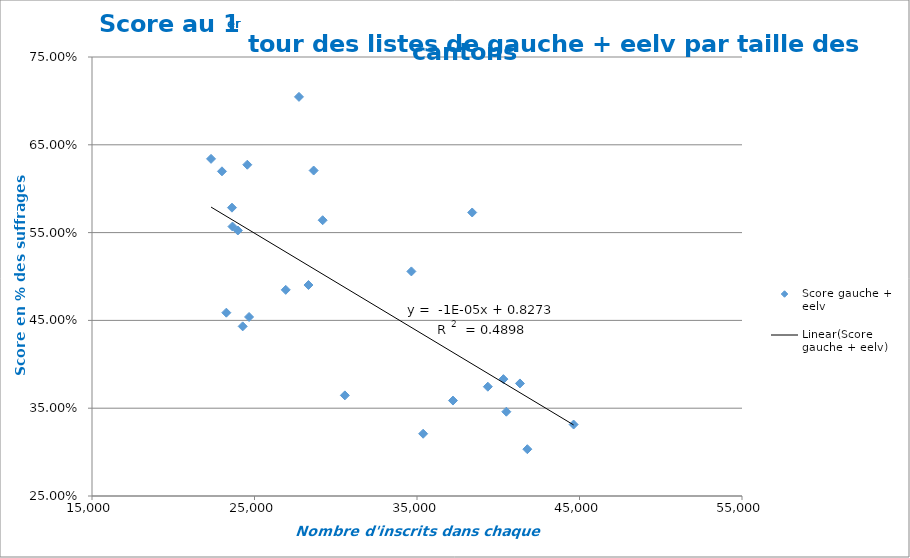
| Category | Score gauche + eelv |
|---|---|
| 23646.0 | 0.557 |
| 28641.0 | 0.621 |
| 28322.0 | 0.49 |
| 24274.0 | 0.443 |
| 40498.0 | 0.346 |
| 26923.0 | 0.485 |
| 23614.0 | 0.578 |
| 23975.0 | 0.552 |
| 38398.0 | 0.573 |
| 34654.0 | 0.506 |
| 27737.0 | 0.705 |
| 24556.0 | 0.627 |
| 35378.0 | 0.321 |
| 44638.0 | 0.331 |
| 24665.0 | 0.454 |
| 37214.0 | 0.359 |
| 41790.0 | 0.303 |
| 40317.0 | 0.383 |
| 30561.0 | 0.365 |
| 29195.0 | 0.564 |
| 23267.0 | 0.459 |
| 39359.0 | 0.374 |
| 41335.0 | 0.378 |
| 22998.0 | 0.62 |
| 22326.0 | 0.634 |